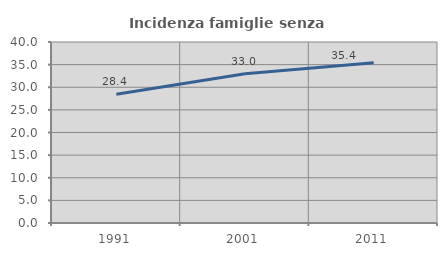
| Category | Incidenza famiglie senza nuclei |
|---|---|
| 1991.0 | 28.432 |
| 2001.0 | 32.994 |
| 2011.0 | 35.398 |